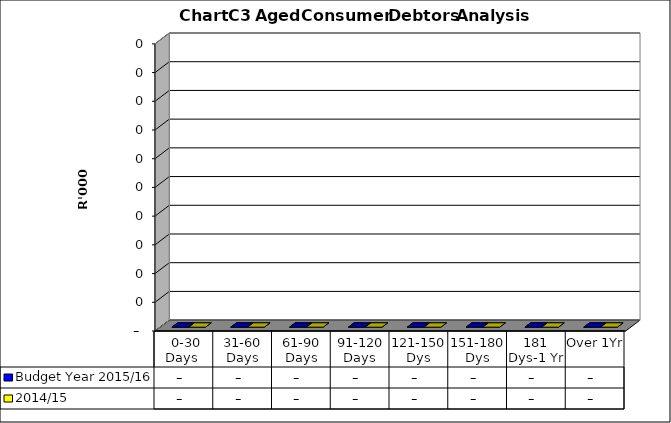
| Category | Budget Year 2015/16 | 2014/15 |
|---|---|---|
|  0-30 Days  | 0 | 0 |
| 31-60 Days | 0 | 0 |
| 61-90 Days | 0 | 0 |
| 91-120 Days | 0 | 0 |
| 121-150 Dys | 0 | 0 |
| 151-180 Dys | 0 | 0 |
| 181 Dys-1 Yr | 0 | 0 |
| Over 1Yr | 0 | 0 |